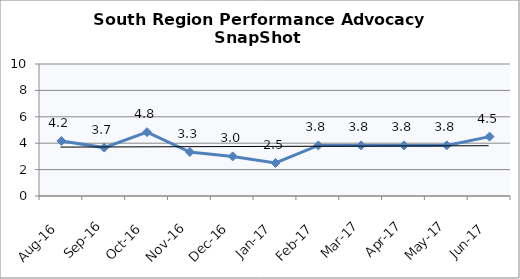
| Category | South Region |
|---|---|
| Aug-16 | 4.167 |
| Sep-16 | 3.667 |
| Oct-16 | 4.833 |
| Nov-16 | 3.333 |
| Dec-16 | 3 |
| Jan-17 | 2.5 |
| Feb-17 | 3.833 |
| Mar-17 | 3.833 |
| Apr-17 | 3.833 |
| May-17 | 3.833 |
| Jun-17 | 4.5 |